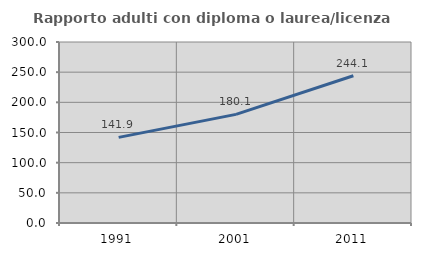
| Category | Rapporto adulti con diploma o laurea/licenza media  |
|---|---|
| 1991.0 | 141.939 |
| 2001.0 | 180.085 |
| 2011.0 | 244.132 |